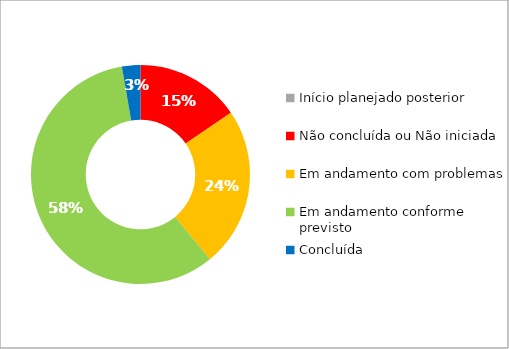
| Category | Series 0 |
|---|---|
| Início planejado posterior | 0 |
| Não concluída ou Não iniciada | 17 |
| Em andamento com problemas | 26 |
| Em andamento conforme previsto | 64 |
| Concluída | 3 |